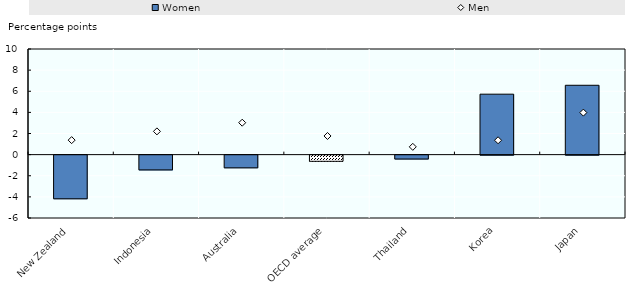
| Category | Women |
|---|---|
| New Zealand | -4.135 |
| Indonesia | -1.4 |
| Australia | -1.205 |
| OECD average | -0.585 |
| Thailand | -0.37 |
| Korea | 5.723 |
| Japan | 6.566 |